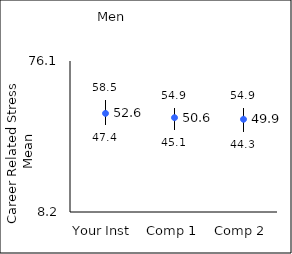
| Category | 25th percentile | 75th percentile | Mean |
|---|---|---|---|
| Your Inst | 47.4 | 58.5 | 52.55 |
| Comp 1 | 45.1 | 54.9 | 50.62 |
| Comp 2 | 44.3 | 54.9 | 49.9 |